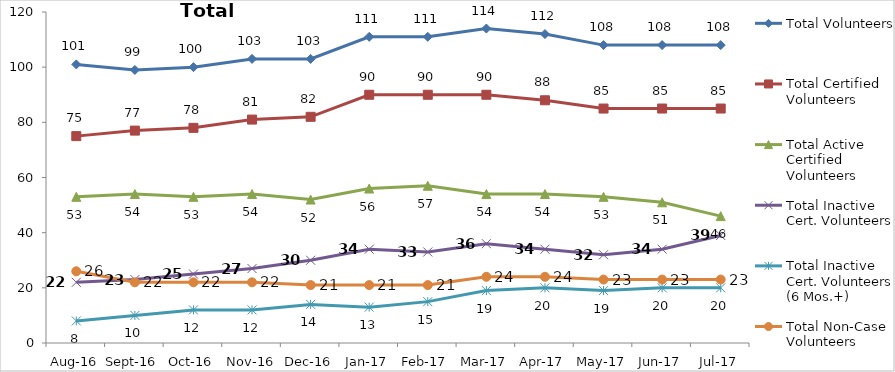
| Category | Total Volunteers | Total Certified Volunteers | Total Active Certified Volunteers | Total Inactive Cert. Volunteers | Total Inactive Cert. Volunteers (6 Mos.+) | Total Non-Case Volunteers |
|---|---|---|---|---|---|---|
| Aug-16 | 101 | 75 | 53 | 22 | 8 | 26 |
| Sep-16 | 99 | 77 | 54 | 23 | 10 | 22 |
| Oct-16 | 100 | 78 | 53 | 25 | 12 | 22 |
| Nov-16 | 103 | 81 | 54 | 27 | 12 | 22 |
| Dec-16 | 103 | 82 | 52 | 30 | 14 | 21 |
| Jan-17 | 111 | 90 | 56 | 34 | 13 | 21 |
| Feb-17 | 111 | 90 | 57 | 33 | 15 | 21 |
| Mar-17 | 114 | 90 | 54 | 36 | 19 | 24 |
| Apr-17 | 112 | 88 | 54 | 34 | 20 | 24 |
| May-17 | 108 | 85 | 53 | 32 | 19 | 23 |
| Jun-17 | 108 | 85 | 51 | 34 | 20 | 23 |
| Jul-17 | 108 | 85 | 46 | 39 | 20 | 23 |